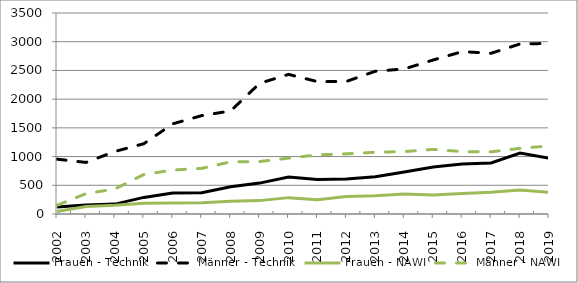
| Category | Frauen - Technik | Männer - Technik | Frauen - NAWI | Männer - NAWI |
|---|---|---|---|---|
| 2002.0 | 123 | 955 | 42 | 150 |
| 2003.0 | 156 | 898 | 130 | 354 |
| 2004.0 | 172 | 1089 | 152 | 436 |
| 2005.0 | 289 | 1224 | 186 | 688 |
| 2006.0 | 365 | 1570 | 190 | 765 |
| 2007.0 | 369 | 1713 | 198 | 795 |
| 2008.0 | 475 | 1795 | 222 | 908 |
| 2009.0 | 538 | 2275 | 233 | 914 |
| 2010.0 | 644 | 2431 | 285 | 973 |
| 2011.0 | 601 | 2305 | 249 | 1030 |
| 2012.0 | 609 | 2308 | 303 | 1048 |
| 2013.0 | 647 | 2486 | 319 | 1075 |
| 2014.0 | 732 | 2526 | 349 | 1087 |
| 2015.0 | 820 | 2682 | 331 | 1125 |
| 2016.0 | 870 | 2827 | 358 | 1087 |
| 2017.0 | 888 | 2799 | 378 | 1082 |
| 2018.0 | 1061 | 2961 | 417 | 1144 |
| 2019.0 | 972 | 2970 | 379 | 1185 |